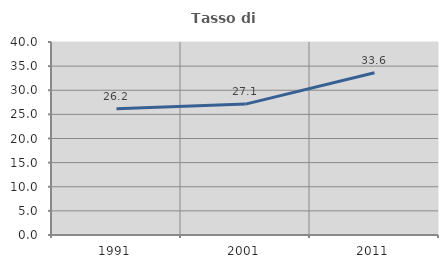
| Category | Tasso di occupazione   |
|---|---|
| 1991.0 | 26.174 |
| 2001.0 | 27.129 |
| 2011.0 | 33.643 |